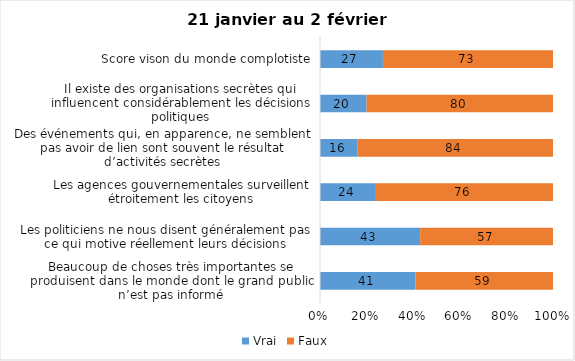
| Category | Vrai | Faux |
|---|---|---|
| Beaucoup de choses très importantes se produisent dans le monde dont le grand public n’est pas informé | 41 | 59 |
| Les politiciens ne nous disent généralement pas ce qui motive réellement leurs décisions | 43 | 57 |
| Les agences gouvernementales surveillent étroitement les citoyens | 24 | 76 |
| Des événements qui, en apparence, ne semblent pas avoir de lien sont souvent le résultat d’activités secrètes | 16 | 84 |
| Il existe des organisations secrètes qui influencent considérablement les décisions politiques | 20 | 80 |
| Score vison du monde complotiste | 27 | 73 |